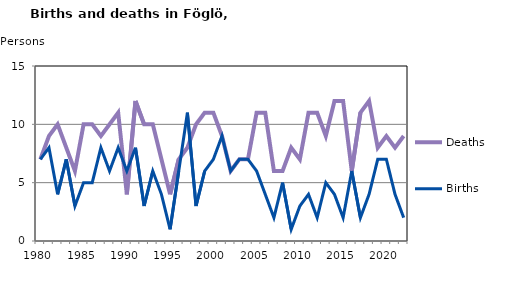
| Category | Deaths | Births |
|---|---|---|
| 1980.0 | 7 | 7 |
| 1981.0 | 9 | 8 |
| 1982.0 | 10 | 4 |
| 1983.0 | 8 | 7 |
| 1984.0 | 6 | 3 |
| 1985.0 | 10 | 5 |
| 1986.0 | 10 | 5 |
| 1987.0 | 9 | 8 |
| 1988.0 | 10 | 6 |
| 1989.0 | 11 | 8 |
| 1990.0 | 4 | 6 |
| 1991.0 | 12 | 8 |
| 1992.0 | 10 | 3 |
| 1993.0 | 10 | 6 |
| 1994.0 | 7 | 4 |
| 1995.0 | 4 | 1 |
| 1996.0 | 7 | 6 |
| 1997.0 | 8 | 11 |
| 1998.0 | 10 | 3 |
| 1999.0 | 11 | 6 |
| 2000.0 | 11 | 7 |
| 2001.0 | 9 | 9 |
| 2002.0 | 6 | 6 |
| 2003.0 | 7 | 7 |
| 2004.0 | 7 | 7 |
| 2005.0 | 11 | 6 |
| 2006.0 | 11 | 4 |
| 2007.0 | 6 | 2 |
| 2008.0 | 6 | 5 |
| 2009.0 | 8 | 1 |
| 2010.0 | 7 | 3 |
| 2011.0 | 11 | 4 |
| 2012.0 | 11 | 2 |
| 2013.0 | 9 | 5 |
| 2014.0 | 12 | 4 |
| 2015.0 | 12 | 2 |
| 2016.0 | 6 | 6 |
| 2017.0 | 11 | 2 |
| 2018.0 | 12 | 4 |
| 2019.0 | 8 | 7 |
| 2020.0 | 9 | 7 |
| 2021.0 | 8 | 4 |
| 2022.0 | 9 | 2 |